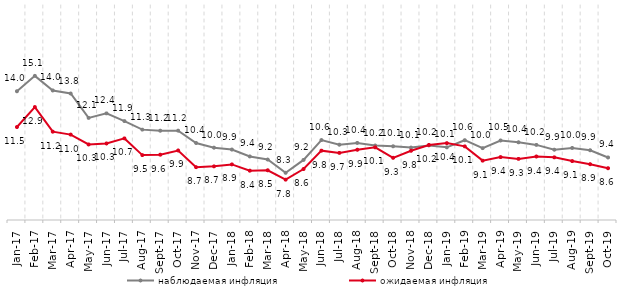
| Category | наблюдаемая инфляция | ожидаемая инфляция |
|---|---|---|
| 2017-01-01 | 13.983 | 11.486 |
| 2017-02-01 | 15.056 | 12.879 |
| 2017-03-01 | 14.037 | 11.162 |
| 2017-04-01 | 13.824 | 10.959 |
| 2017-05-01 | 12.123 | 10.27 |
| 2017-06-01 | 12.44 | 10.34 |
| 2017-07-01 | 11.9 | 10.692 |
| 2017-08-01 | 11.305 | 9.527 |
| 2017-09-01 | 11.229 | 9.556 |
| 2017-10-01 | 11.232 | 9.85 |
| 2017-11-01 | 10.372 | 8.687 |
| 2017-12-01 | 10.047 | 8.742 |
| 2018-01-01 | 9.916 | 8.879 |
| 2018-02-01 | 9.433 | 8.44 |
| 2018-03-01 | 9.218 | 8.469 |
| 2018-04-01 | 8.292 | 7.814 |
| 2018-05-01 | 9.192 | 8.556 |
| 2018-06-01 | 10.578 | 9.837 |
| 2018-07-01 | 10.255 | 9.682 |
| 2018-08-01 | 10.378 | 9.901 |
| 2018-09-01 | 10.196 | 10.07 |
| 2018-10-01 | 10.143 | 9.339 |
| 2018-11-01 | 10.053 | 9.831 |
| 2018-12-01 | 10.205 | 10.236 |
| 2019-01-01 | 10.071 | 10.363 |
| 2019-02-01 | 10.567 | 10.136 |
| 2019-03-01 | 10.013 | 9.141 |
| 2019-04-01 | 10.548 | 9.39 |
| 2019-05-01 | 10.421 | 9.264 |
| 2019-06-01 | 10.239 | 9.429 |
| 2019-07-01 | 9.904 | 9.371 |
| 2019-08-01 | 10.027 | 9.11 |
| 2019-09-01 | 9.867 | 8.894 |
| 2019-10-01 | 9.362 | 8.612 |